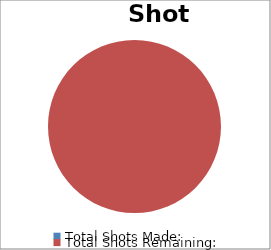
| Category | Series 0 |
|---|---|
| Total Shots Made: | 0 |
| Total Shots Remaining: | 10000 |